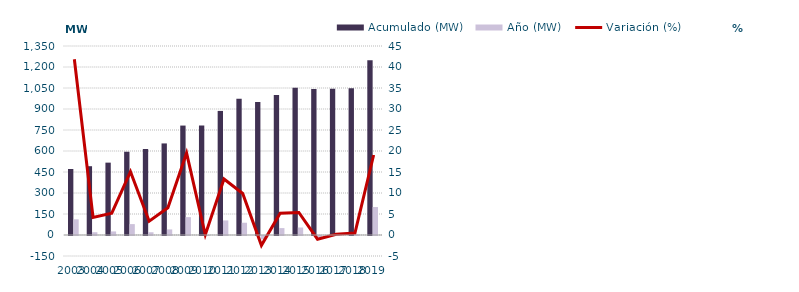
| Category | Acumulado (MW) | Año (MW) |
|---|---|---|
| 2003.0 | 471.643 | 111.954 |
| 2004.0 | 491.375 | 19.731 |
| 2005.0 | 516.874 | 25.5 |
| 2006.0 | 594.724 | 77.85 |
| 2007.0 | 614.237 | 19.512 |
| 2008.0 | 654.063 | 39.826 |
| 2009.0 | 781.673 | 127.61 |
| 2010.0 | 782.152 | 0.479 |
| 2011.0 | 886.288 | 104.136 |
| 2012.0 | 973.93 | 87.643 |
| 2013.0 | 949.94 | -23.99 |
| 2014.0 | 999.181 | 49.241 |
| 2015.0 | 1052.676 | 53.494 |
| 2016.0 | 1042.066 | -10.609 |
| 2017.0 | 1043.793 | 1.726 |
| 2018.0 | 1048.464 | 4.671 |
| 2019.0 | 1248.132 | 199.669 |